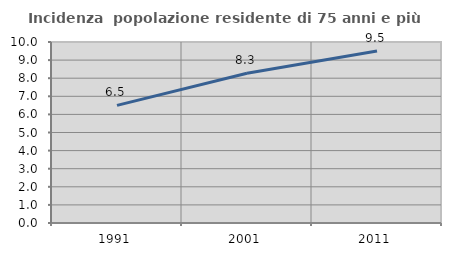
| Category | Incidenza  popolazione residente di 75 anni e più |
|---|---|
| 1991.0 | 6.5 |
| 2001.0 | 8.277 |
| 2011.0 | 9.502 |